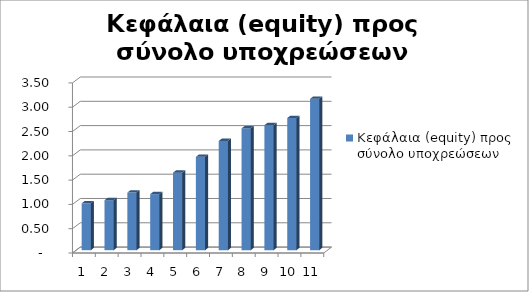
| Category | Κεφάλαια (equity) προς σύνολο υποχρεώσεων |
|---|---|
| 0 | 0.964 |
| 1 | 1.028 |
| 2 | 1.185 |
| 3 | 1.154 |
| 4 | 1.595 |
| 5 | 1.921 |
| 6 | 2.248 |
| 7 | 2.507 |
| 8 | 2.572 |
| 9 | 2.72 |
| 10 | 3.116 |